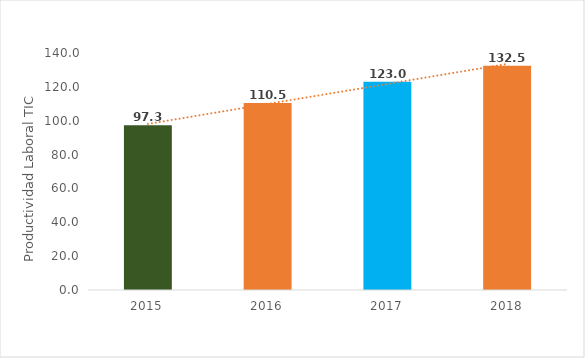
| Category | Actividades TIC |
|---|---|
| 2015.0 | 97.286 |
| 2016.0 | 110.496 |
| 2017.0 | 123.01 |
| 2018.0 | 132.505 |